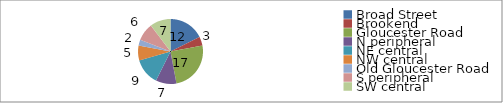
| Category | Series 0 |
|---|---|
| Broad Street | 12 |
| Brookend | 3 |
| Gloucester Road | 17 |
| N peripheral | 7 |
| NE central | 9 |
| NW central | 5 |
| Old Gloucester Road | 2 |
| S peripheral | 6 |
| SW central | 7 |